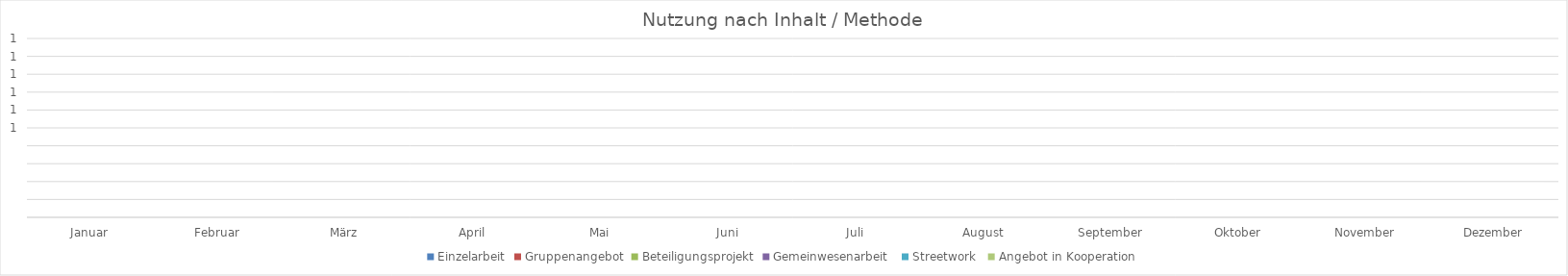
| Category | Einzelarbeit | Gruppenangebot | Beteiligungsprojekt | Gemeinwesenarbeit  | Streetwork  | Angebot in Kooperation |
|---|---|---|---|---|---|---|
| Januar | 0 | 0 | 0 | 0 | 0 | 0 |
| Februar | 0 | 0 | 0 | 0 | 0 | 0 |
| März | 0 | 0 | 0 | 0 | 0 | 0 |
| April | 0 | 0 | 0 | 0 | 0 | 0 |
| Mai | 0 | 0 | 0 | 0 | 0 | 0 |
| Juni | 0 | 0 | 0 | 0 | 0 | 0 |
| Juli | 0 | 0 | 0 | 0 | 0 | 0 |
| August | 0 | 0 | 0 | 0 | 0 | 0 |
| September | 0 | 0 | 0 | 0 | 0 | 0 |
| Oktober | 0 | 0 | 0 | 0 | 0 | 0 |
| November | 0 | 0 | 0 | 0 | 0 | 0 |
| Dezember | 0 | 0 | 0 | 0 | 0 | 0 |